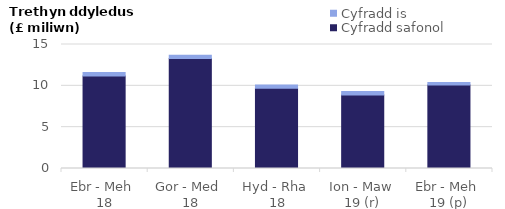
| Category | Cyfradd safonol | Cyfradd is |
|---|---|---|
| Ebr - Meh 
18 | 11.2 | 0.4 |
| Gor - Med 
18 | 13.3 | 0.4 |
| Hyd - Rha 
18 | 9.7 | 0.4 |
| Ion - Maw 
19 (r) | 8.9 | 0.4 |
| Ebr - Meh 
19 (p) | 10.1 | 0.3 |